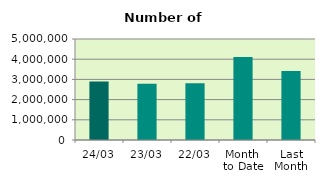
| Category | Series 0 |
|---|---|
| 24/03 | 2895196 |
| 23/03 | 2788872 |
| 22/03 | 2812288 |
| Month 
to Date | 4104676.556 |
| Last
Month | 3413232.3 |